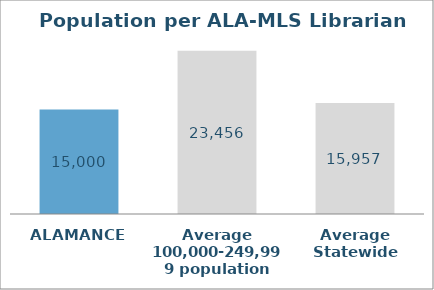
| Category | Series 1 |
|---|---|
| ALAMANCE | 14999.727 |
| Average 100,000-249,999 population | 23456.446 |
| Average Statewide | 15957.084 |